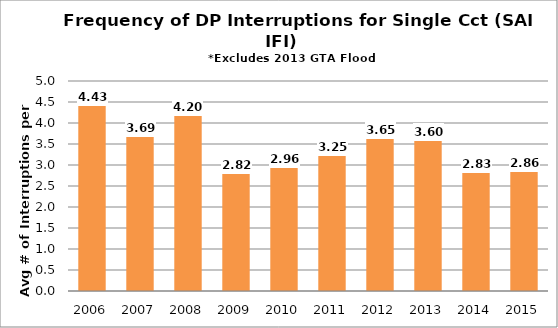
| Category | T-SAIFI-sc |
|---|---|
| 2006.0 | 4.426 |
| 2007.0 | 3.694 |
| 2008.0 | 4.2 |
| 2009.0 | 2.818 |
| 2010.0 | 2.957 |
| 2011.0 | 3.245 |
| 2012.0 | 3.648 |
| 2013.0 | 3.599 |
| 2014.0 | 2.827 |
| 2015.0 | 2.856 |